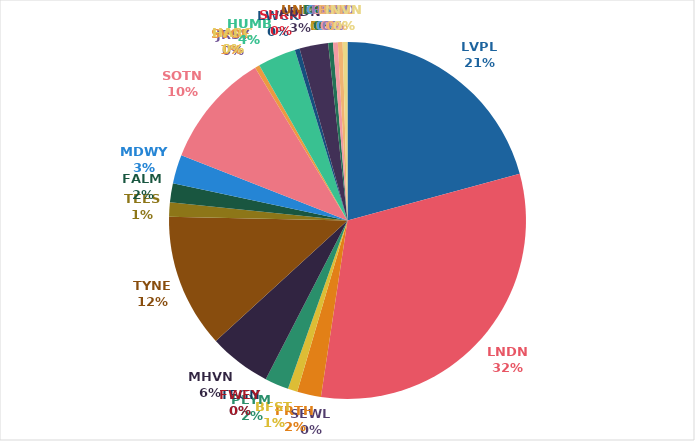
| Category | Series 0 |
|---|---|
| LVPL | 48 |
| LNDN | 73 |
| SEWL | 0 |
| FRTH | 5 |
| BFST | 2 |
| PLYM | 5 |
| TEGN | 0 |
| FWEY | 0 |
| MHVN | 13 |
| TYNE | 28 |
| TEES | 3 |
| FALM | 4 |
| MDWY | 6 |
| SOTN | 24 |
| JRSY | 0 |
| SVOE | 1 |
| HARC | 0 |
| HUMB | 8 |
| LWCK | 1 |
| SHRM | 0 |
| ABDN | 6 |
| UNKNOWN | 0 |
| PSTH | 0 |
| DOVR | 1 |
| GUER | 0 |
| CLYD | 1 |
| HOHD | 0 |
| BSTL | 1 |
| INVN | 1 |